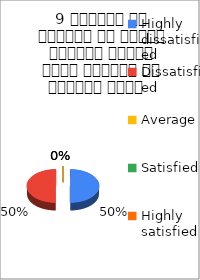
| Category | 9 शिक्षक ने शिक्षण के दौरान आधुनिक तकनीक पावर पॉइन्ट का प्रयोग किया   |
|---|---|
| Highly dissatisfied | 1 |
| Dissatisfied | 1 |
| Average | 0 |
| Satisfied | 0 |
| Highly satisfied | 0 |